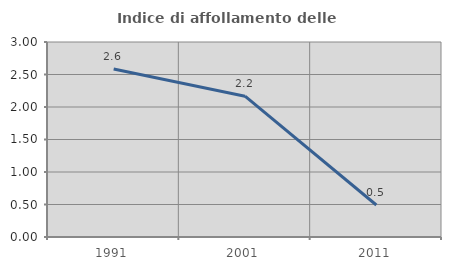
| Category | Indice di affollamento delle abitazioni  |
|---|---|
| 1991.0 | 2.585 |
| 2001.0 | 2.167 |
| 2011.0 | 0.493 |